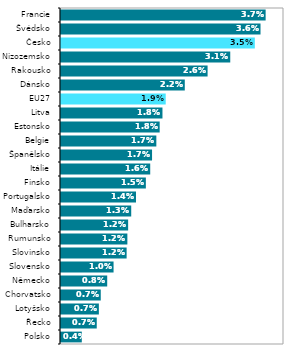
| Category | Series 1 |
|---|---|
| Polsko | 0.004 |
| Řecko | 0.007 |
| Lotyšsko | 0.007 |
| Chorvatsko | 0.007 |
| Německo | 0.008 |
| Slovensko | 0.01 |
| Slovinsko | 0.012 |
| Rumunsko | 0.012 |
| Bulharsko | 0.012 |
| Maďarsko | 0.013 |
| Portugalsko | 0.014 |
| Finsko | 0.015 |
| Itálie | 0.016 |
| Španělsko | 0.017 |
| Belgie | 0.017 |
| Estonsko | 0.018 |
| Litva | 0.018 |
| EU27 | 0.019 |
| Dánsko | 0.022 |
| Rakousko | 0.026 |
| Nizozemsko | 0.031 |
| Česko | 0.035 |
| Švédsko | 0.036 |
| Francie | 0.037 |